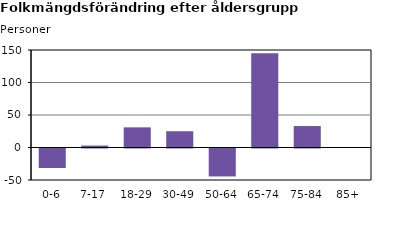
| Category | Series 2 |
|---|---|
| 0-6 | -30 |
| 7-17 | 3 |
| 18-29 | 31 |
| 30-49 | 25 |
| 50-64 | -43 |
| 65-74 | 145 |
| 75-84 | 33 |
| 85+ | 0 |